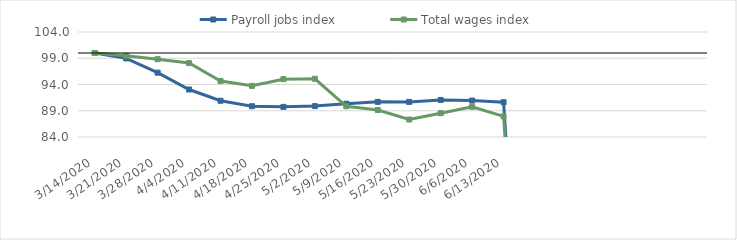
| Category | Payroll jobs index | Total wages index |
|---|---|---|
| 14/03/2020 | 100 | 100 |
| 21/03/2020 | 98.976 | 99.462 |
| 28/03/2020 | 96.258 | 98.824 |
| 04/04/2020 | 93.045 | 98.083 |
| 11/04/2020 | 90.902 | 94.662 |
| 18/04/2020 | 89.861 | 93.747 |
| 25/04/2020 | 89.74 | 95.012 |
| 02/05/2020 | 89.886 | 95.087 |
| 09/05/2020 | 90.351 | 89.848 |
| 16/05/2020 | 90.693 | 89.144 |
| 23/05/2020 | 90.686 | 87.327 |
| 30/05/2020 | 91.057 | 88.533 |
| 06/06/2020 | 90.936 | 89.755 |
| 13/06/2020 | 90.626 | 87.931 |